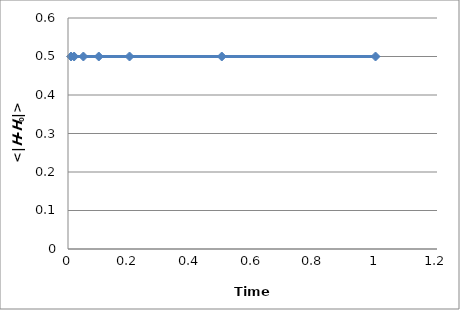
| Category | Series 0 |
|---|---|
| 0.01 | 0.5 |
| 0.02 | 0.5 |
| 0.05 | 0.5 |
| 0.1 | 0.5 |
| 0.2 | 0.5 |
| 0.5 | 0.5 |
| 1.0 | 0.5 |